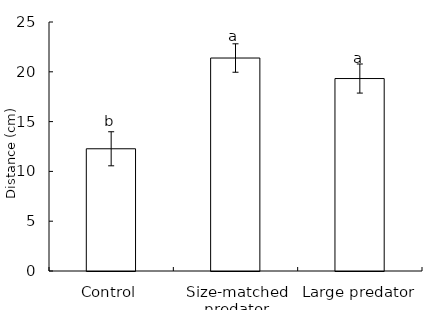
| Category | Series 0 |
|---|---|
| Control | 12.272 |
| Size-matched predator | 21.383 |
| Large predator | 19.323 |